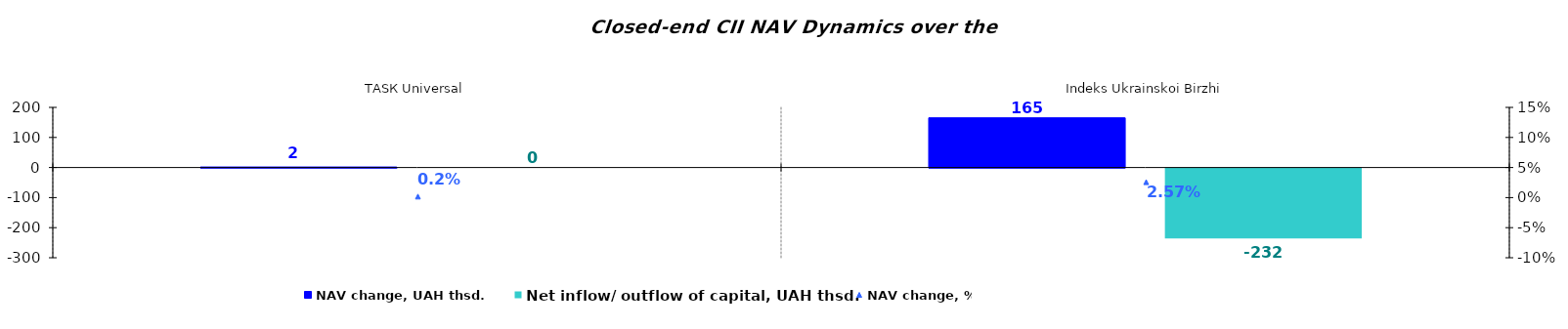
| Category | NAV change, UAH thsd. | Net inflow/ outflow of capital, UAH thsd. |
|---|---|---|
| ТАSК Universal | 1.701 | 0 |
| Indeks Ukrainskoi Birzhi | 165.399 | -232.323 |